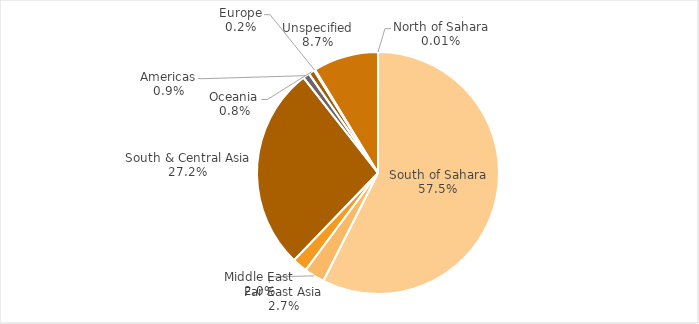
| Category | Series 0 |
|---|---|
| North of Sahara | 0.358 |
| South of Sahara | 4098.805 |
| Far East Asia | 195.236 |
| Middle East | 142.492 |
| South & Central Asia | 1943.771 |
| Americas | 62.794 |
| Oceania | 57.414 |
| Europe | 11.294 |
| Unspecified | 621.572 |